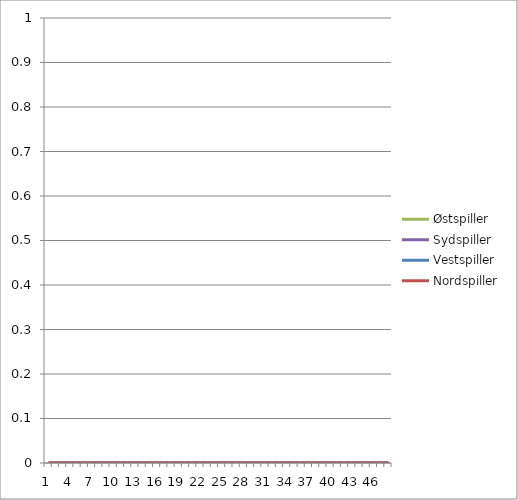
| Category | Østspiller | Sydspiller | Vestspiller | Nordspiller |
|---|---|---|---|---|
| 0 | 0 | 0 | 0 | 0 |
| 1 | 0 | 0 | 0 | 0 |
| 2 | 0 | 0 | 0 | 0 |
| 3 | 0 | 0 | 0 | 0 |
| 4 | 0 | 0 | 0 | 0 |
| 5 | 0 | 0 | 0 | 0 |
| 6 | 0 | 0 | 0 | 0 |
| 7 | 0 | 0 | 0 | 0 |
| 8 | 0 | 0 | 0 | 0 |
| 9 | 0 | 0 | 0 | 0 |
| 10 | 0 | 0 | 0 | 0 |
| 11 | 0 | 0 | 0 | 0 |
| 12 | 0 | 0 | 0 | 0 |
| 13 | 0 | 0 | 0 | 0 |
| 14 | 0 | 0 | 0 | 0 |
| 15 | 0 | 0 | 0 | 0 |
| 16 | 0 | 0 | 0 | 0 |
| 17 | 0 | 0 | 0 | 0 |
| 18 | 0 | 0 | 0 | 0 |
| 19 | 0 | 0 | 0 | 0 |
| 20 | 0 | 0 | 0 | 0 |
| 21 | 0 | 0 | 0 | 0 |
| 22 | 0 | 0 | 0 | 0 |
| 23 | 0 | 0 | 0 | 0 |
| 24 | 0 | 0 | 0 | 0 |
| 25 | 0 | 0 | 0 | 0 |
| 26 | 0 | 0 | 0 | 0 |
| 27 | 0 | 0 | 0 | 0 |
| 28 | 0 | 0 | 0 | 0 |
| 29 | 0 | 0 | 0 | 0 |
| 30 | 0 | 0 | 0 | 0 |
| 31 | 0 | 0 | 0 | 0 |
| 32 | 0 | 0 | 0 | 0 |
| 33 | 0 | 0 | 0 | 0 |
| 34 | 0 | 0 | 0 | 0 |
| 35 | 0 | 0 | 0 | 0 |
| 36 | 0 | 0 | 0 | 0 |
| 37 | 0 | 0 | 0 | 0 |
| 38 | 0 | 0 | 0 | 0 |
| 39 | 0 | 0 | 0 | 0 |
| 40 | 0 | 0 | 0 | 0 |
| 41 | 0 | 0 | 0 | 0 |
| 42 | 0 | 0 | 0 | 0 |
| 43 | 0 | 0 | 0 | 0 |
| 44 | 0 | 0 | 0 | 0 |
| 45 | 0 | 0 | 0 | 0 |
| 46 | 0 | 0 | 0 | 0 |
| 47 | 0 | 0 | 0 | 0 |